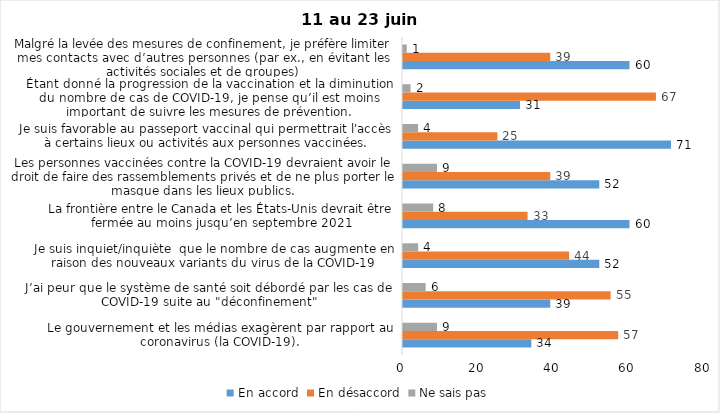
| Category | En accord | En désaccord | Ne sais pas |
|---|---|---|---|
| Le gouvernement et les médias exagèrent par rapport au coronavirus (la COVID-19). | 34 | 57 | 9 |
| J’ai peur que le système de santé soit débordé par les cas de COVID-19 suite au "déconfinement" | 39 | 55 | 6 |
| Je suis inquiet/inquiète  que le nombre de cas augmente en raison des nouveaux variants du virus de la COVID-19 | 52 | 44 | 4 |
| La frontière entre le Canada et les États-Unis devrait être fermée au moins jusqu’en septembre 2021 | 60 | 33 | 8 |
| Les personnes vaccinées contre la COVID-19 devraient avoir le droit de faire des rassemblements privés et de ne plus porter le masque dans les lieux publics. | 52 | 39 | 9 |
| Je suis favorable au passeport vaccinal qui permettrait l'accès à certains lieux ou activités aux personnes vaccinées. | 71 | 25 | 4 |
| Étant donné la progression de la vaccination et la diminution du nombre de cas de COVID-19, je pense qu’il est moins important de suivre les mesures de prévention. | 31 | 67 | 2 |
| Malgré la levée des mesures de confinement, je préfère limiter mes contacts avec d’autres personnes (par ex., en évitant les activités sociales et de groupes) | 60 | 39 | 1 |